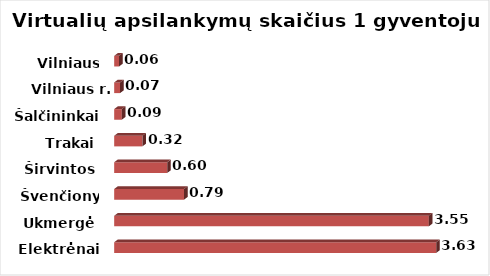
| Category | Series 0 |
|---|---|
| Elektrėnai | 3.634 |
| Ukmergė | 3.55 |
| Švenčionys | 0.788 |
| Širvintos | 0.598 |
| Trakai | 0.318 |
| Šalčininkai | 0.086 |
| Vilniaus r. | 0.066 |
| Vilniaus m. | 0.055 |